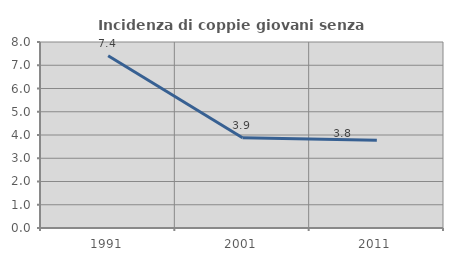
| Category | Incidenza di coppie giovani senza figli |
|---|---|
| 1991.0 | 7.407 |
| 2001.0 | 3.883 |
| 2011.0 | 3.774 |